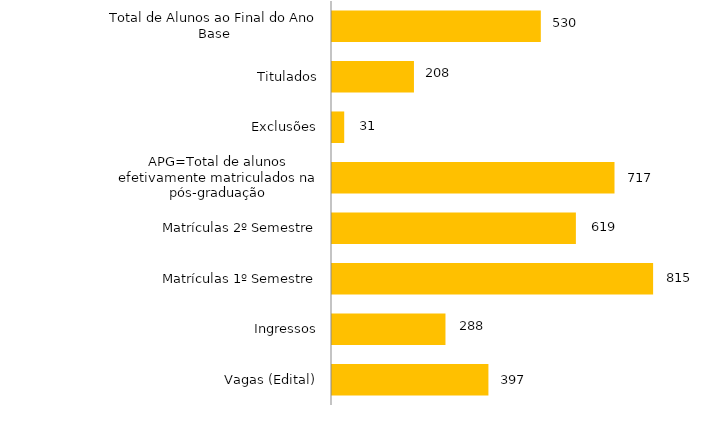
| Category | Curso |
|---|---|
| Vagas (Edital) | 397 |
| Ingressos | 288 |
| Matrículas 1º Semestre | 815 |
| Matrículas 2º Semestre | 619 |
| APG=Total de alunos efetivamente matriculados na pós-graduação | 717 |
| Exclusões | 31 |
| Titulados | 208 |
| Total de Alunos ao Final do Ano Base | 530 |